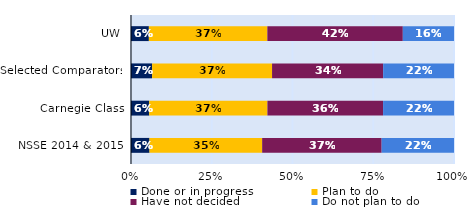
| Category | Done or in progress | Plan to do | Have not decided | Do not plan to do |
|---|---|---|---|---|
| UW | 0.055 | 0.367 | 0.419 | 0.158 |
| Selected Comparators | 0.065 | 0.371 | 0.344 | 0.219 |
| Carnegie Class | 0.056 | 0.366 | 0.358 | 0.22 |
| NSSE 2014 & 2015 | 0.057 | 0.349 | 0.37 | 0.224 |